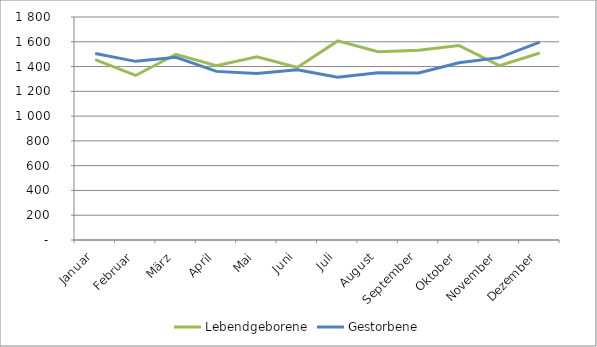
| Category | Lebendgeborene | Gestorbene |
|---|---|---|
| Januar | 1456 | 1505 |
| Februar | 1328 | 1442 |
| März | 1499 | 1475 |
| April | 1406 | 1361 |
| Mai | 1478 | 1344 |
| Juni | 1393 | 1375 |
| Juli | 1607 | 1313 |
| August | 1520 | 1350 |
| September | 1532 | 1348 |
| Oktober | 1570 | 1430 |
| November | 1408 | 1472 |
| Dezember | 1509 | 1597 |